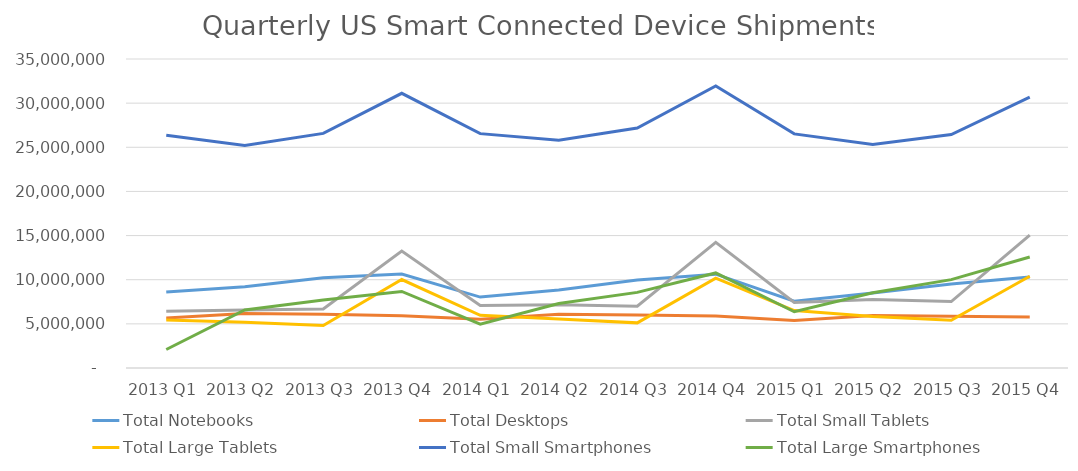
| Category | Total Notebooks | Total Desktops | Total Small Tablets | Total Large Tablets | Total Small Smartphones | Total Large Smartphones |
|---|---|---|---|---|---|---|
| 2013 Q1 | 8619203 | 5676535 | 6439943 | 5423984 | 26355668 | 2097880 |
| 2013 Q2 | 9192472 | 6166669 | 6576148 | 5172990 | 25210872 | 6582397 |
| 2013 Q3 | 10213227 | 6099048 | 6684752 | 4808630 | 26572402 | 7699504 |
| 2013 Q4 | 10638136 | 5925739 | 13247769 | 10022047 | 31114279 | 8667173 |
| 2014 Q1 | 8032537 | 5524278 | 7085052 | 5972913 | 26546207 | 4957308 |
| 2014 Q2 | 8826503 | 6095829 | 7152475 | 5551936 | 25785645 | 7295535 |
| 2014 Q3 | 9976335 | 6004995 | 7001338 | 5111521 | 27188568 | 8566103 |
| 2014 Q4 | 10624318 | 5894872 | 14236736 | 10185158 | 31944281 | 10769519 |
| 2015 Q1 | 7559460 | 5375647 | 7428223 | 6500687 | 26515716 | 6368531 |
| 2015 Q2 | 8495808 | 5940249 | 7755987 | 5822842 | 25310128 | 8515721 |
| 2015 Q3 | 9527536 | 5869405 | 7522831 | 5411814 | 26442239 | 10010981 |
| 2015 Q4 | 10306956 | 5779012 | 15056759 | 10399087 | 30689220 | 12578580 |